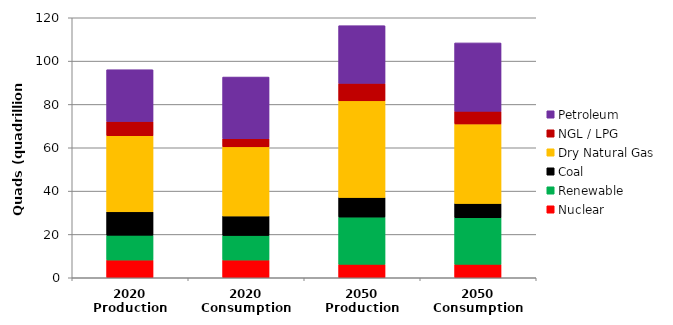
| Category | Nuclear | Renewable | Coal | Dry Natural Gas | NGL / LPG | Petroleum |
|---|---|---|---|---|---|---|
| 2020 Production | 8.205 | 11.433 | 10.8 | 35.145 | 6.583 | 23.869 |
| 2020 Consumption | 8.205 | 11.345 | 8.988 | 31.894 | 3.76 | 28.458 |
| 2050 Production | 6.206 | 21.798 | 9.082 | 44.584 | 8.055 | 26.641 |
| 2050 Consumption | 6.206 | 21.509 | 6.602 | 36.697 | 5.844 | 31.534 |